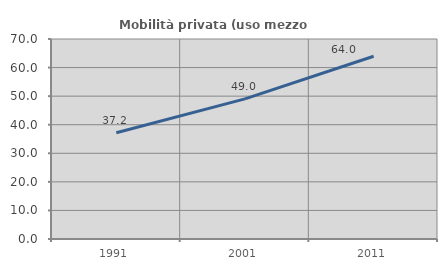
| Category | Mobilità privata (uso mezzo privato) |
|---|---|
| 1991.0 | 37.182 |
| 2001.0 | 49.038 |
| 2011.0 | 63.969 |